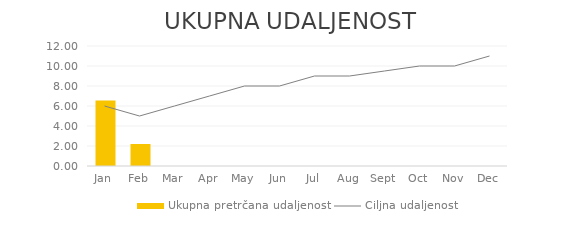
| Category | Ukupna pretrčana udaljenost |
|---|---|
| 2012-01-01 | 6.55 |
| 2012-02-01 | 2.2 |
| 2012-03-01 | 0 |
| 2012-04-01 | 0 |
| 2012-05-01 | 0 |
| 2012-06-01 | 0 |
| 2012-07-01 | 0 |
| 2012-08-01 | 0 |
| 2012-09-01 | 0 |
| 2012-10-01 | 0 |
| 2012-11-01 | 0 |
| 2012-12-01 | 0 |